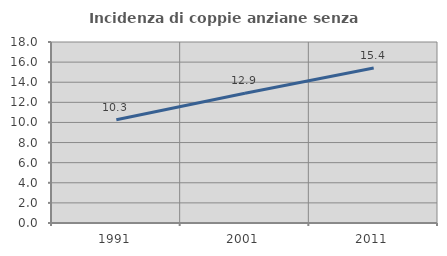
| Category | Incidenza di coppie anziane senza figli  |
|---|---|
| 1991.0 | 10.264 |
| 2001.0 | 12.908 |
| 2011.0 | 15.419 |